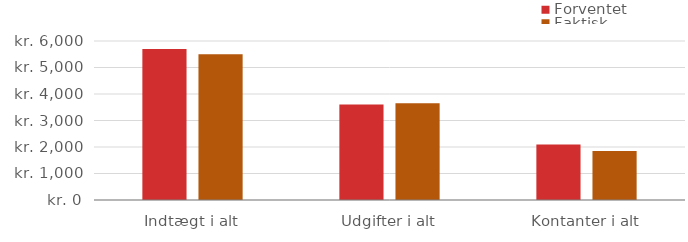
| Category | Forventet | Faktisk |
|---|---|---|
| Indtægt i alt | 5700 | 5500 |
| Udgifter i alt | 3603 | 3655 |
| Kontanter i alt | 2097 | 1845 |